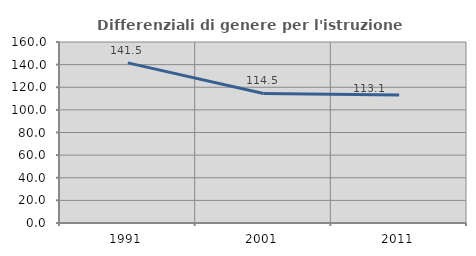
| Category | Differenziali di genere per l'istruzione superiore |
|---|---|
| 1991.0 | 141.527 |
| 2001.0 | 114.489 |
| 2011.0 | 113.101 |